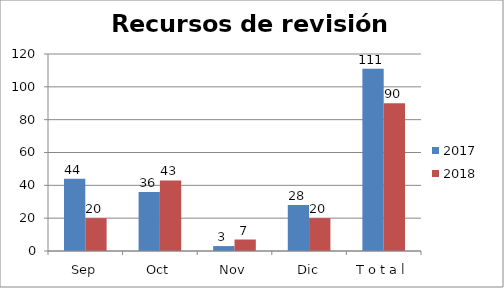
| Category | 2017 | 2018 |
|---|---|---|
| Sep | 44 | 20 |
| Oct | 36 | 43 |
| Nov | 3 | 7 |
| Dic | 28 | 20 |
| T o t a l | 111 | 90 |